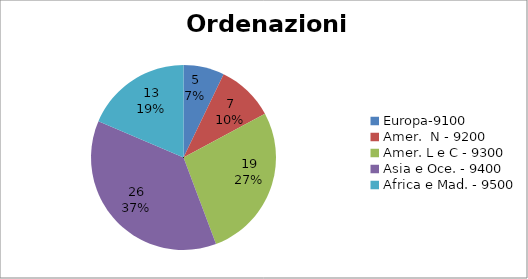
| Category | Series 0 |
|---|---|
| Europa-9100 | 5 |
| Amer.  N - 9200 | 7 |
| Amer. L e C - 9300 | 19 |
| Asia e Oce. - 9400 | 26 |
| Africa e Mad. - 9500 | 13 |